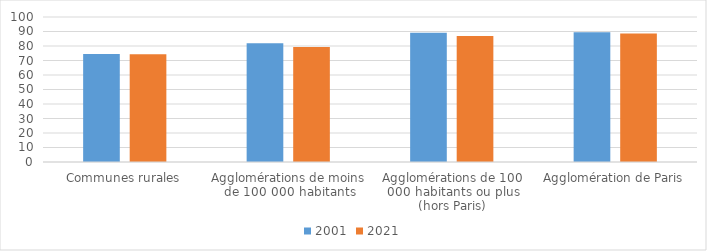
| Category | 2001 | 2021 |
|---|---|---|
| Communes rurales | 74.505 | 74.393 |
| Agglomérations de moins de 100 000 habitants | 81.862 | 79.282 |
| Agglomérations de 100 000 habitants ou plus (hors Paris) | 89.169 | 86.831 |
| Agglomération de Paris | 89.527 | 88.665 |